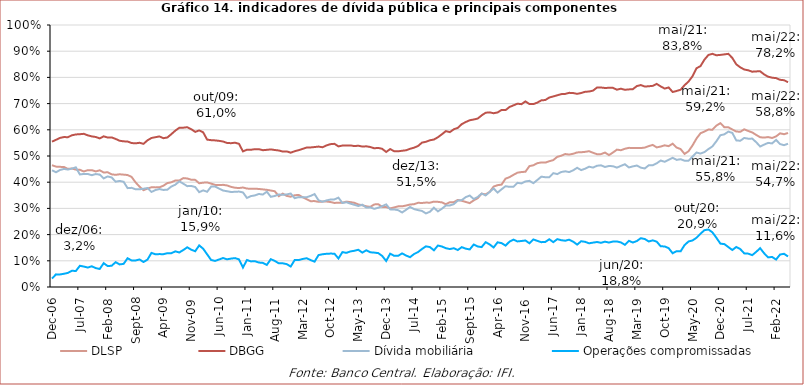
| Category | DLSP | DBGG | Dívida mobiliária | Operações compromissadas |
|---|---|---|---|---|
| 2006-12-01 | 0.465 | 0.555 | 0.446 | 0.032 |
| 2007-01-01 | 0.459 | 0.562 | 0.438 | 0.048 |
| 2007-02-01 | 0.459 | 0.569 | 0.447 | 0.048 |
| 2007-03-01 | 0.458 | 0.572 | 0.451 | 0.05 |
| 2007-04-01 | 0.451 | 0.572 | 0.448 | 0.054 |
| 2007-05-01 | 0.452 | 0.579 | 0.452 | 0.062 |
| 2007-06-01 | 0.448 | 0.582 | 0.457 | 0.061 |
| 2007-07-01 | 0.447 | 0.583 | 0.43 | 0.081 |
| 2007-08-01 | 0.441 | 0.585 | 0.432 | 0.078 |
| 2007-09-01 | 0.446 | 0.579 | 0.431 | 0.074 |
| 2007-10-01 | 0.446 | 0.575 | 0.427 | 0.079 |
| 2007-11-01 | 0.441 | 0.573 | 0.431 | 0.072 |
| 2007-12-01 | 0.445 | 0.567 | 0.429 | 0.069 |
| 2008-01-01 | 0.437 | 0.575 | 0.415 | 0.091 |
| 2008-02-01 | 0.438 | 0.57 | 0.422 | 0.08 |
| 2008-03-01 | 0.43 | 0.571 | 0.418 | 0.081 |
| 2008-04-01 | 0.428 | 0.565 | 0.402 | 0.095 |
| 2008-05-01 | 0.43 | 0.558 | 0.405 | 0.086 |
| 2008-06-01 | 0.429 | 0.556 | 0.402 | 0.088 |
| 2008-07-01 | 0.427 | 0.555 | 0.377 | 0.11 |
| 2008-08-01 | 0.42 | 0.549 | 0.378 | 0.101 |
| 2008-09-01 | 0.4 | 0.548 | 0.373 | 0.101 |
| 2008-10-01 | 0.383 | 0.55 | 0.373 | 0.105 |
| 2008-11-01 | 0.37 | 0.546 | 0.375 | 0.095 |
| 2008-12-01 | 0.376 | 0.56 | 0.378 | 0.105 |
| 2009-01-01 | 0.381 | 0.569 | 0.363 | 0.13 |
| 2009-02-01 | 0.38 | 0.572 | 0.37 | 0.125 |
| 2009-03-01 | 0.38 | 0.575 | 0.374 | 0.126 |
| 2009-04-01 | 0.387 | 0.568 | 0.37 | 0.125 |
| 2009-05-01 | 0.397 | 0.571 | 0.372 | 0.129 |
| 2009-06-01 | 0.4 | 0.583 | 0.383 | 0.129 |
| 2009-07-01 | 0.406 | 0.597 | 0.39 | 0.136 |
| 2009-08-01 | 0.406 | 0.608 | 0.403 | 0.132 |
| 2009-09-01 | 0.416 | 0.608 | 0.394 | 0.141 |
| 2009-10-01 | 0.414 | 0.61 | 0.385 | 0.151 |
| 2009-11-01 | 0.409 | 0.602 | 0.386 | 0.142 |
| 2009-12-01 | 0.409 | 0.592 | 0.382 | 0.136 |
| 2010-01-01 | 0.396 | 0.598 | 0.362 | 0.159 |
| 2010-02-01 | 0.398 | 0.59 | 0.369 | 0.146 |
| 2010-03-01 | 0.399 | 0.562 | 0.364 | 0.125 |
| 2010-04-01 | 0.395 | 0.56 | 0.383 | 0.103 |
| 2010-05-01 | 0.39 | 0.56 | 0.384 | 0.1 |
| 2010-06-01 | 0.389 | 0.558 | 0.376 | 0.105 |
| 2010-07-01 | 0.39 | 0.555 | 0.368 | 0.111 |
| 2010-08-01 | 0.388 | 0.55 | 0.365 | 0.106 |
| 2010-09-01 | 0.382 | 0.549 | 0.363 | 0.108 |
| 2010-10-01 | 0.379 | 0.551 | 0.363 | 0.11 |
| 2010-11-01 | 0.378 | 0.546 | 0.364 | 0.106 |
| 2010-12-01 | 0.38 | 0.518 | 0.361 | 0.074 |
| 2011-01-01 | 0.376 | 0.524 | 0.34 | 0.103 |
| 2011-02-01 | 0.375 | 0.524 | 0.347 | 0.098 |
| 2011-03-01 | 0.375 | 0.526 | 0.35 | 0.098 |
| 2011-04-01 | 0.374 | 0.526 | 0.355 | 0.093 |
| 2011-05-01 | 0.373 | 0.522 | 0.353 | 0.092 |
| 2011-06-01 | 0.371 | 0.524 | 0.364 | 0.084 |
| 2011-07-01 | 0.368 | 0.525 | 0.344 | 0.106 |
| 2011-08-01 | 0.365 | 0.523 | 0.347 | 0.1 |
| 2011-09-01 | 0.347 | 0.521 | 0.353 | 0.09 |
| 2011-10-01 | 0.356 | 0.517 | 0.352 | 0.09 |
| 2011-11-01 | 0.348 | 0.518 | 0.353 | 0.087 |
| 2011-12-01 | 0.345 | 0.513 | 0.357 | 0.078 |
| 2012-01-01 | 0.35 | 0.518 | 0.339 | 0.103 |
| 2012-02-01 | 0.352 | 0.522 | 0.343 | 0.103 |
| 2012-03-01 | 0.343 | 0.527 | 0.342 | 0.107 |
| 2012-04-01 | 0.335 | 0.532 | 0.343 | 0.11 |
| 2012-05-01 | 0.328 | 0.533 | 0.348 | 0.103 |
| 2012-06-01 | 0.328 | 0.534 | 0.355 | 0.097 |
| 2012-07-01 | 0.325 | 0.536 | 0.331 | 0.122 |
| 2012-08-01 | 0.326 | 0.533 | 0.325 | 0.125 |
| 2012-09-01 | 0.326 | 0.54 | 0.33 | 0.127 |
| 2012-10-01 | 0.324 | 0.545 | 0.334 | 0.128 |
| 2012-11-01 | 0.321 | 0.546 | 0.334 | 0.127 |
| 2012-12-01 | 0.322 | 0.537 | 0.341 | 0.109 |
| 2013-01-01 | 0.322 | 0.54 | 0.321 | 0.133 |
| 2013-02-01 | 0.326 | 0.54 | 0.324 | 0.13 |
| 2013-03-01 | 0.324 | 0.541 | 0.318 | 0.136 |
| 2013-04-01 | 0.321 | 0.538 | 0.314 | 0.138 |
| 2013-05-01 | 0.315 | 0.539 | 0.309 | 0.142 |
| 2013-06-01 | 0.312 | 0.536 | 0.314 | 0.131 |
| 2013-07-01 | 0.308 | 0.537 | 0.303 | 0.14 |
| 2013-08-01 | 0.306 | 0.534 | 0.304 | 0.132 |
| 2013-09-01 | 0.315 | 0.529 | 0.298 | 0.131 |
| 2013-10-01 | 0.316 | 0.531 | 0.303 | 0.129 |
| 2013-11-01 | 0.306 | 0.527 | 0.308 | 0.119 |
| 2013-12-01 | 0.305 | 0.515 | 0.315 | 0.099 |
| 2014-01-01 | 0.3 | 0.526 | 0.296 | 0.127 |
| 2014-02-01 | 0.304 | 0.518 | 0.296 | 0.119 |
| 2014-03-01 | 0.308 | 0.518 | 0.293 | 0.119 |
| 2014-04-01 | 0.308 | 0.52 | 0.284 | 0.128 |
| 2014-05-01 | 0.311 | 0.522 | 0.295 | 0.12 |
| 2014-06-01 | 0.315 | 0.527 | 0.305 | 0.114 |
| 2014-07-01 | 0.316 | 0.532 | 0.297 | 0.126 |
| 2014-08-01 | 0.321 | 0.538 | 0.294 | 0.133 |
| 2014-09-01 | 0.321 | 0.551 | 0.29 | 0.145 |
| 2014-10-01 | 0.322 | 0.554 | 0.281 | 0.155 |
| 2014-11-01 | 0.322 | 0.56 | 0.287 | 0.152 |
| 2014-12-01 | 0.326 | 0.563 | 0.303 | 0.14 |
| 2015-01-01 | 0.325 | 0.572 | 0.289 | 0.158 |
| 2015-02-01 | 0.323 | 0.583 | 0.299 | 0.155 |
| 2015-03-01 | 0.316 | 0.595 | 0.311 | 0.148 |
| 2015-04-01 | 0.323 | 0.591 | 0.311 | 0.145 |
| 2015-05-01 | 0.324 | 0.602 | 0.316 | 0.148 |
| 2015-06-01 | 0.332 | 0.607 | 0.33 | 0.141 |
| 2015-07-01 | 0.329 | 0.622 | 0.332 | 0.152 |
| 2015-08-01 | 0.325 | 0.63 | 0.343 | 0.146 |
| 2015-09-01 | 0.32 | 0.636 | 0.349 | 0.144 |
| 2015-10-01 | 0.331 | 0.639 | 0.336 | 0.162 |
| 2015-11-01 | 0.339 | 0.643 | 0.344 | 0.155 |
| 2015-12-01 | 0.356 | 0.655 | 0.357 | 0.152 |
| 2016-01-01 | 0.353 | 0.665 | 0.35 | 0.171 |
| 2016-02-01 | 0.363 | 0.667 | 0.363 | 0.163 |
| 2016-03-01 | 0.383 | 0.663 | 0.376 | 0.151 |
| 2016-04-01 | 0.389 | 0.666 | 0.36 | 0.171 |
| 2016-05-01 | 0.391 | 0.676 | 0.373 | 0.168 |
| 2016-06-01 | 0.413 | 0.675 | 0.385 | 0.158 |
| 2016-07-01 | 0.419 | 0.687 | 0.382 | 0.173 |
| 2016-08-01 | 0.428 | 0.693 | 0.383 | 0.181 |
| 2016-09-01 | 0.436 | 0.7 | 0.398 | 0.174 |
| 2016-10-01 | 0.439 | 0.698 | 0.395 | 0.176 |
| 2016-11-01 | 0.44 | 0.708 | 0.403 | 0.177 |
| 2016-12-01 | 0.461 | 0.698 | 0.405 | 0.167 |
| 2017-01-01 | 0.465 | 0.698 | 0.396 | 0.181 |
| 2017-02-01 | 0.473 | 0.704 | 0.409 | 0.176 |
| 2017-03-01 | 0.475 | 0.712 | 0.421 | 0.171 |
| 2017-04-01 | 0.475 | 0.714 | 0.419 | 0.172 |
| 2017-05-01 | 0.48 | 0.723 | 0.419 | 0.182 |
| 2017-06-01 | 0.484 | 0.727 | 0.435 | 0.171 |
| 2017-07-01 | 0.497 | 0.732 | 0.431 | 0.183 |
| 2017-08-01 | 0.501 | 0.736 | 0.439 | 0.179 |
| 2017-09-01 | 0.508 | 0.737 | 0.442 | 0.177 |
| 2017-10-01 | 0.505 | 0.741 | 0.439 | 0.181 |
| 2017-11-01 | 0.509 | 0.74 | 0.445 | 0.173 |
| 2017-12-01 | 0.514 | 0.737 | 0.455 | 0.162 |
| 2018-01-01 | 0.514 | 0.74 | 0.446 | 0.175 |
| 2018-02-01 | 0.516 | 0.745 | 0.451 | 0.172 |
| 2018-03-01 | 0.518 | 0.746 | 0.459 | 0.167 |
| 2018-04-01 | 0.512 | 0.75 | 0.456 | 0.169 |
| 2018-05-01 | 0.507 | 0.761 | 0.463 | 0.172 |
| 2018-06-01 | 0.507 | 0.761 | 0.464 | 0.169 |
| 2018-07-01 | 0.513 | 0.76 | 0.458 | 0.173 |
| 2018-08-01 | 0.503 | 0.76 | 0.462 | 0.17 |
| 2018-09-01 | 0.513 | 0.76 | 0.461 | 0.174 |
| 2018-10-01 | 0.524 | 0.753 | 0.456 | 0.174 |
| 2018-11-01 | 0.522 | 0.757 | 0.462 | 0.17 |
| 2018-12-01 | 0.528 | 0.753 | 0.469 | 0.161 |
| 2019-01-01 | 0.531 | 0.754 | 0.456 | 0.176 |
| 2019-02-01 | 0.531 | 0.755 | 0.46 | 0.17 |
| 2019-03-01 | 0.53 | 0.767 | 0.464 | 0.175 |
| 2019-04-01 | 0.53 | 0.771 | 0.456 | 0.186 |
| 2019-05-01 | 0.532 | 0.765 | 0.452 | 0.183 |
| 2019-06-01 | 0.538 | 0.766 | 0.465 | 0.174 |
| 2019-07-01 | 0.542 | 0.768 | 0.465 | 0.178 |
| 2019-08-01 | 0.533 | 0.775 | 0.472 | 0.173 |
| 2019-09-01 | 0.536 | 0.766 | 0.483 | 0.155 |
| 2019-10-01 | 0.541 | 0.757 | 0.478 | 0.155 |
| 2019-11-01 | 0.538 | 0.762 | 0.486 | 0.148 |
| 2019-12-01 | 0.547 | 0.744 | 0.493 | 0.129 |
| 2020-01-01 | 0.532 | 0.748 | 0.485 | 0.137 |
| 2020-02-01 | 0.526 | 0.753 | 0.488 | 0.136 |
| 2020-03-01 | 0.508 | 0.77 | 0.482 | 0.16 |
| 2020-04-01 | 0.518 | 0.784 | 0.482 | 0.174 |
| 2020-05-01 | 0.54 | 0.804 | 0.498 | 0.178 |
| 2020-06-01 | 0.567 | 0.835 | 0.513 | 0.188 |
| 2020-07-01 | 0.587 | 0.843 | 0.509 | 0.203 |
| 2020-08-01 | 0.593 | 0.868 | 0.515 | 0.217 |
| 2020-09-01 | 0.601 | 0.886 | 0.526 | 0.219 |
| 2020-10-01 | 0.6 | 0.89 | 0.537 | 0.209 |
| 2020-11-01 | 0.616 | 0.884 | 0.556 | 0.188 |
| 2020-12-01 | 0.625 | 0.886 | 0.579 | 0.165 |
| 2021-01-01 | 0.61 | 0.888 | 0.583 | 0.164 |
| 2021-02-01 | 0.61 | 0.89 | 0.593 | 0.153 |
| 2021-03-01 | 0.601 | 0.874 | 0.588 | 0.141 |
| 2021-04-01 | 0.594 | 0.85 | 0.56 | 0.153 |
| 2021-05-01 | 0.592 | 0.838 | 0.558 | 0.145 |
| 2021-06-01 | 0.602 | 0.83 | 0.569 | 0.128 |
| 2021-07-01 | 0.595 | 0.827 | 0.566 | 0.127 |
| 2021-08-01 | 0.59 | 0.822 | 0.566 | 0.122 |
| 2021-09-01 | 0.581 | 0.823 | 0.553 | 0.134 |
| 2021-10-01 | 0.572 | 0.823 | 0.536 | 0.148 |
| 2021-11-01 | 0.57 | 0.811 | 0.543 | 0.129 |
| 2021-12-01 | 0.572 | 0.803 | 0.55 | 0.113 |
| 2022-01-01 | 0.569 | 0.799 | 0.548 | 0.115 |
| 2022-02-01 | 0.575 | 0.797 | 0.561 | 0.105 |
| 2022-03-01 | 0.587 | 0.791 | 0.546 | 0.124 |
| 2022-04-01 | 0.583 | 0.789 | 0.541 | 0.127 |
| 2022-05-01 | 0.588 | 0.782 | 0.547 | 0.116 |